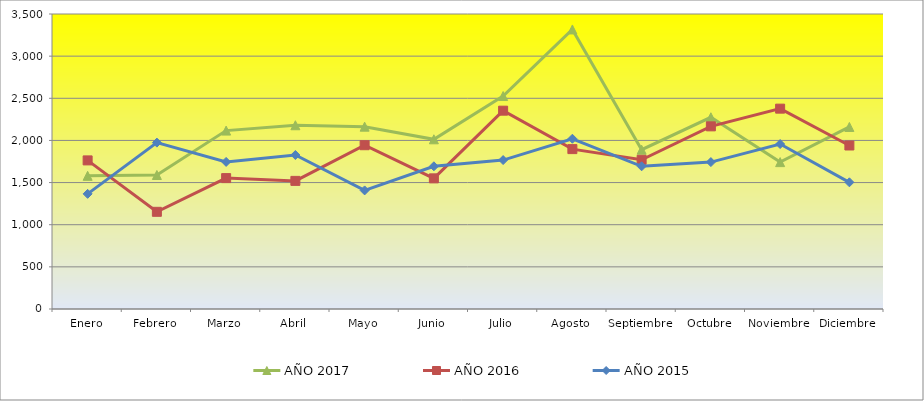
| Category | AÑO 2017 | AÑO 2016 | AÑO 2015 |
|---|---|---|---|
| Enero | 1580 | 1763 | 1366 |
| Febrero | 1590 | 1153 | 1974 |
| Marzo | 2116.667 | 1553 | 1745 |
| Abril | 2180 | 1520 | 1827 |
| Mayo | 2163.333 | 1943 | 1407 |
| Junio | 2013.333 | 1550 | 1693 |
| Julio | 2526.667 | 2353 | 1767 |
| Agosto | 3316.667 | 1897 | 2020 |
| Septiembre | 1890 | 1770 | 1693 |
| Octubre | 2274.783 | 2167 | 1743 |
| Noviembre | 1742.609 | 2377 | 1957 |
| Diciembre | 2160 | 1940 | 1503 |